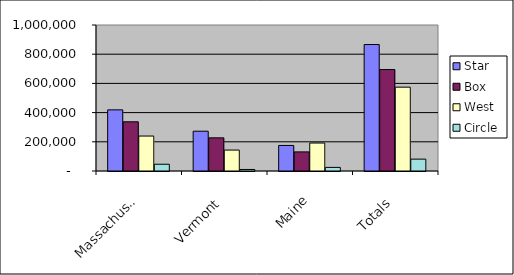
| Category | Star | Box | West | Circle |
|---|---|---|---|---|
| Massachusetts | 418679 | 337102 | 239312 | 46325 |
| Vermont | 272522 | 227150 | 143400 | 10390 |
| Maine | 175000 | 130808 | 191500 | 24615 |
| Totals | 866201 | 695060 | 574212 | 81330 |